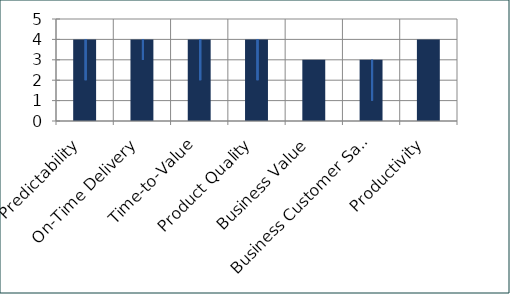
| Category | Series 2 |
|---|---|
| Predictability | 4 |
| On-Time Delivery | 4 |
| Time-to-Value | 4 |
| Product Quality | 4 |
| Business Value | 3 |
| Business Customer Satisfaction | 3 |
| Productivity | 4 |